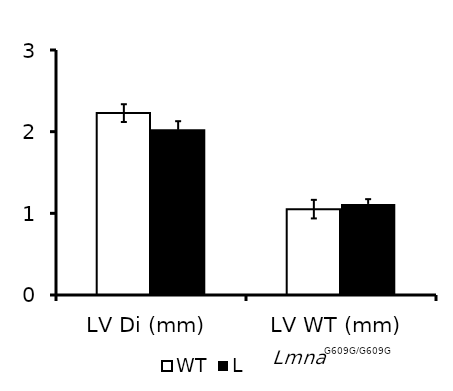
| Category | WT | Lmna |
|---|---|---|
| LV Di (mm) | 2.227 | 2.029 |
| LV WT (mm) | 1.051 | 1.115 |